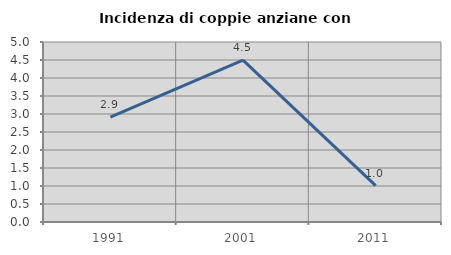
| Category | Incidenza di coppie anziane con figli |
|---|---|
| 1991.0 | 2.913 |
| 2001.0 | 4.494 |
| 2011.0 | 1.01 |